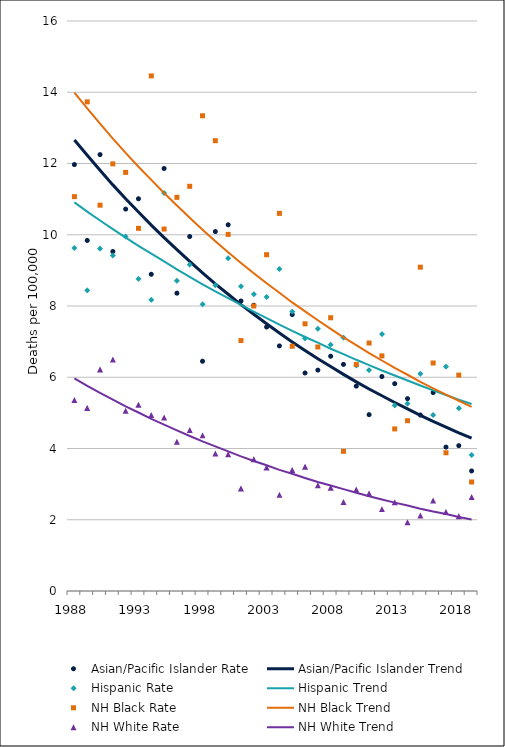
| Category | Asian/Pacific Islander Rate | Asian/Pacific Islander Trend | Hispanic Rate | Hispanic Trend | NH Black Rate | NH Black Trend | NH White Rate | NH White Trend |
|---|---|---|---|---|---|---|---|---|
| 1988.0 | 11.97 | 12.66 | 9.63 | 10.91 | 11.07 | 13.99 | 5.36 | 5.97 |
| 1989.0 | 9.84 | 12.23 | 8.44 | 10.65 | 13.73 | 13.55 | 5.14 | 5.76 |
| 1990.0 | 12.25 | 11.81 | 9.61 | 10.4 | 10.83 | 13.12 | 6.22 | 5.56 |
| 1991.0 | 9.53 | 11.4 | 9.42 | 10.16 | 11.99 | 12.7 | 6.5 | 5.37 |
| 1992.0 | 10.72 | 11.01 | 9.95 | 9.92 | 11.75 | 12.3 | 5.06 | 5.18 |
| 1993.0 | 11.01 | 10.64 | 8.76 | 9.69 | 10.18 | 11.91 | 5.23 | 5.01 |
| 1994.0 | 8.89 | 10.27 | 8.17 | 9.47 | 14.46 | 11.54 | 4.94 | 4.83 |
| 1995.0 | 11.86 | 9.92 | 11.17 | 9.25 | 10.16 | 11.17 | 4.87 | 4.67 |
| 1996.0 | 8.36 | 9.58 | 8.71 | 9.03 | 11.05 | 10.82 | 4.19 | 4.51 |
| 1997.0 | 9.95 | 9.25 | 9.16 | 8.82 | 11.36 | 10.48 | 4.52 | 4.35 |
| 1998.0 | 6.45 | 8.93 | 8.05 | 8.61 | 13.34 | 10.14 | 4.37 | 4.2 |
| 1999.0 | 10.09 | 8.62 | 8.58 | 8.41 | 12.64 | 9.82 | 3.86 | 4.06 |
| 2000.0 | 10.28 | 8.33 | 9.34 | 8.22 | 10.01 | 9.51 | 3.84 | 3.92 |
| 2001.0 | 8.14 | 8.04 | 8.55 | 8.03 | 7.03 | 9.21 | 2.88 | 3.78 |
| 2002.0 | 8.02 | 7.77 | 8.33 | 7.84 | 8 | 8.92 | 3.7 | 3.65 |
| 2003.0 | 7.41 | 7.5 | 8.25 | 7.66 | 9.44 | 8.64 | 3.47 | 3.53 |
| 2004.0 | 6.88 | 7.24 | 9.04 | 7.48 | 10.6 | 8.37 | 2.7 | 3.4 |
| 2005.0 | 7.76 | 6.99 | 7.84 | 7.3 | 6.87 | 8.1 | 3.4 | 3.29 |
| 2006.0 | 6.12 | 6.75 | 7.09 | 7.13 | 7.5 | 7.85 | 3.49 | 3.17 |
| 2007.0 | 6.2 | 6.52 | 7.36 | 6.97 | 6.85 | 7.6 | 2.97 | 3.06 |
| 2008.0 | 6.59 | 6.3 | 6.91 | 6.8 | 7.67 | 7.36 | 2.9 | 2.96 |
| 2009.0 | 6.36 | 6.08 | 7.11 | 6.65 | 3.92 | 7.12 | 2.5 | 2.86 |
| 2010.0 | 5.75 | 5.87 | 6.33 | 6.49 | 6.36 | 6.9 | 2.85 | 2.76 |
| 2011.0 | 4.95 | 5.67 | 6.2 | 6.34 | 6.96 | 6.68 | 2.74 | 2.66 |
| 2012.0 | 6.02 | 5.48 | 7.21 | 6.19 | 6.6 | 6.47 | 2.3 | 2.57 |
| 2013.0 | 5.82 | 5.29 | 5.21 | 6.05 | 4.55 | 6.26 | 2.49 | 2.48 |
| 2014.0 | 5.4 | 5.11 | 5.26 | 5.91 | 4.78 | 6.07 | 1.93 | 2.4 |
| 2015.0 | 4.94 | 4.93 | 6.1 | 5.77 | 9.09 | 5.87 | 2.12 | 2.31 |
| 2016.0 | 5.57 | 4.76 | 4.94 | 5.63 | 6.4 | 5.69 | 2.54 | 2.23 |
| 2017.0 | 4.04 | 4.6 | 6.3 | 5.5 | 3.88 | 5.51 | 2.22 | 2.16 |
| 2018.0 | 4.08 | 4.44 | 5.13 | 5.37 | 6.06 | 5.34 | 2.1 | 2.08 |
| 2019.0 | 3.37 | 4.29 | 3.82 | 5.25 | 3.06 | 5.17 | 2.64 | 2.01 |